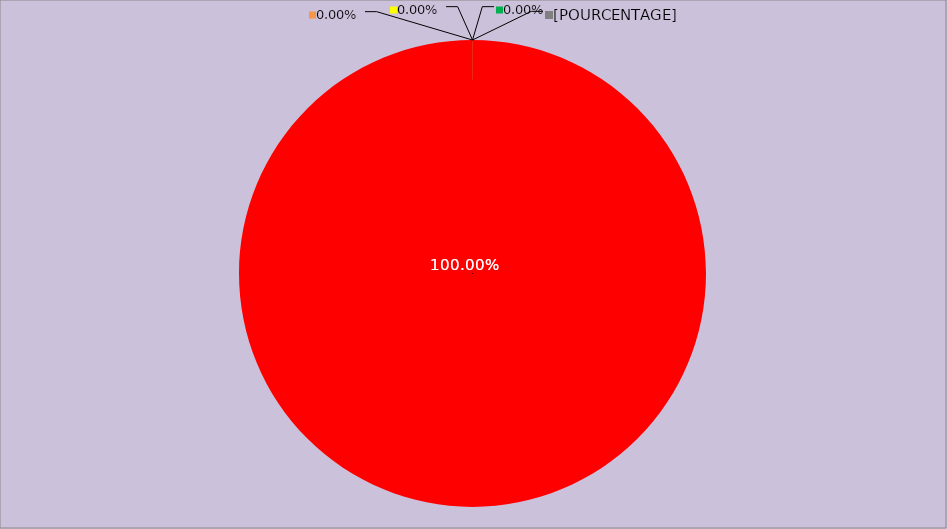
| Category | Année 2019 |
|---|---|
| Mesures non appliquées | 168 |
| Mesures appliquées mais peu ou pas documentées | 0 |
| Mesures appliquées et documentées | 0 |
| Mesures appliquées, documentées et contrôlées | 0 |
| Mesures non applicables | 0 |